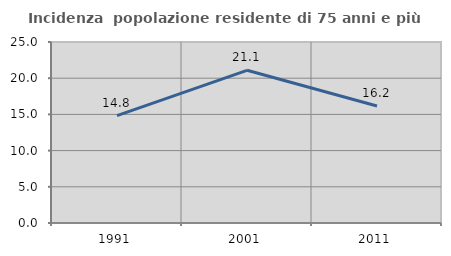
| Category | Incidenza  popolazione residente di 75 anni e più |
|---|---|
| 1991.0 | 14.839 |
| 2001.0 | 21.088 |
| 2011.0 | 16.165 |